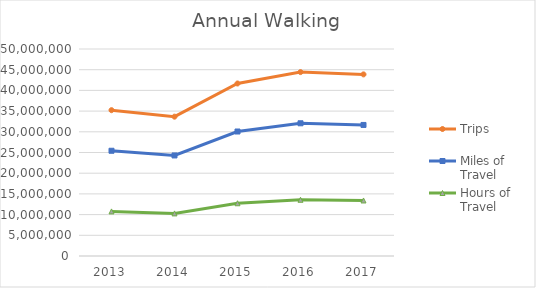
| Category | Trips | Miles of Travel | Hours of Travel |
|---|---|---|---|
| 2013 | 35223941.289 | 25419004.992 | 10769984.229 |
| 2014 | 33657243.73 | 24288413.365 | 10290954.7 |
| 2015 | 41667582.017 | 30068993.887 | 12740175.709 |
| 2016 | 44422140.208 | 32056793.26 | 13582402.535 |
| 2017 | 43868433.254 | 31657216.173 | 13413102.481 |